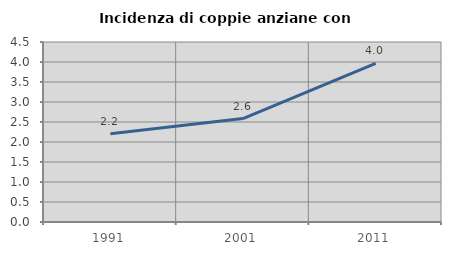
| Category | Incidenza di coppie anziane con figli |
|---|---|
| 1991.0 | 2.206 |
| 2001.0 | 2.586 |
| 2011.0 | 3.968 |